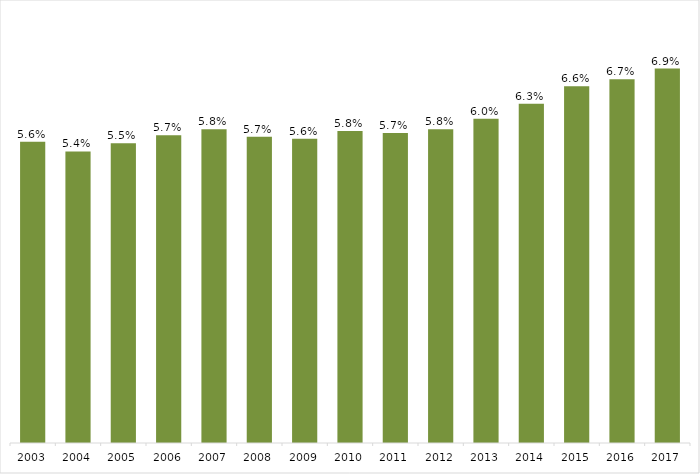
| Category | % |
|---|---|
| 2003.0 | 0.056 |
| 2004.0 | 0.054 |
| 2005.0 | 0.055 |
| 2006.0 | 0.057 |
| 2007.0 | 0.058 |
| 2008.0 | 0.057 |
| 2009.0 | 0.056 |
| 2010.0 | 0.058 |
| 2011.0 | 0.057 |
| 2012.0 | 0.058 |
| 2013.0 | 0.06 |
| 2014.0 | 0.063 |
| 2015.0 | 0.066 |
| 2016.0 | 0.067 |
| 2017.0 | 0.069 |